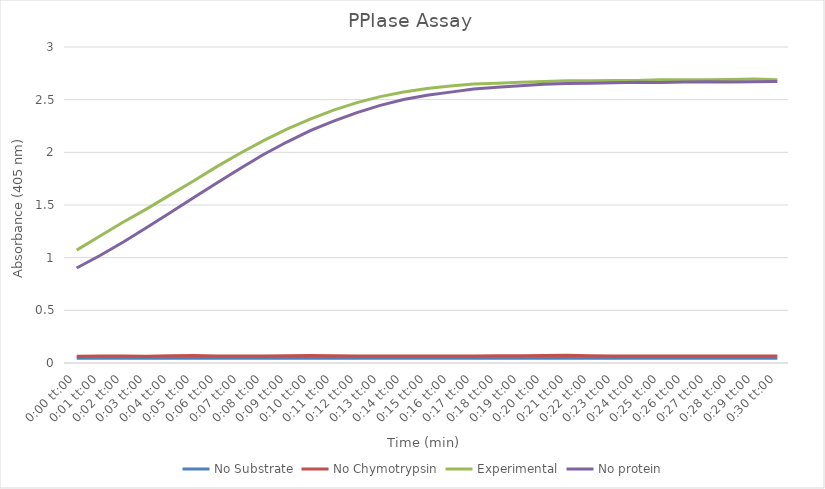
| Category | No Substrate | No Chymotrypsin | Experimental | No protein |
|---|---|---|---|---|
| 0.0 | 0.044 | 0.065 | 1.072 | 0.902 |
| 0.000694444444444444 | 0.044 | 0.067 | 1.206 | 1.02 |
| 0.00138888888888889 | 0.046 | 0.066 | 1.338 | 1.149 |
| 0.00208333333333333 | 0.045 | 0.064 | 1.463 | 1.287 |
| 0.00277777777777778 | 0.044 | 0.07 | 1.596 | 1.427 |
| 0.00347222222222222 | 0.044 | 0.07 | 1.728 | 1.568 |
| 0.00416666666666667 | 0.044 | 0.067 | 1.864 | 1.708 |
| 0.00486111111111111 | 0.044 | 0.067 | 1.992 | 1.846 |
| 0.00555555555555555 | 0.044 | 0.067 | 2.11 | 1.98 |
| 0.00625 | 0.044 | 0.069 | 2.219 | 2.098 |
| 0.00694444444444444 | 0.044 | 0.072 | 2.315 | 2.206 |
| 0.00763888888888889 | 0.044 | 0.07 | 2.401 | 2.296 |
| 0.00833333333333333 | 0.044 | 0.067 | 2.471 | 2.377 |
| 0.00902777777777778 | 0.044 | 0.066 | 2.529 | 2.445 |
| 0.00972222222222222 | 0.044 | 0.065 | 2.572 | 2.501 |
| 0.0104166666666667 | 0.044 | 0.066 | 2.605 | 2.542 |
| 0.0111111111111111 | 0.044 | 0.067 | 2.629 | 2.572 |
| 0.0118055555555556 | 0.044 | 0.067 | 2.648 | 2.6 |
| 0.0125 | 0.044 | 0.068 | 2.657 | 2.618 |
| 0.0131944444444444 | 0.044 | 0.07 | 2.665 | 2.632 |
| 0.0138888888888889 | 0.044 | 0.072 | 2.672 | 2.645 |
| 0.0145833333333333 | 0.044 | 0.074 | 2.678 | 2.654 |
| 0.0152777777777778 | 0.044 | 0.07 | 2.68 | 2.657 |
| 0.0159722222222222 | 0.044 | 0.066 | 2.682 | 2.661 |
| 0.0166666666666667 | 0.044 | 0.066 | 2.683 | 2.665 |
| 0.0173611111111111 | 0.044 | 0.066 | 2.688 | 2.664 |
| 0.0180555555555556 | 0.044 | 0.066 | 2.688 | 2.667 |
| 0.01875 | 0.044 | 0.066 | 2.688 | 2.671 |
| 0.0194444444444444 | 0.044 | 0.066 | 2.691 | 2.669 |
| 0.0201388888888889 | 0.044 | 0.067 | 2.696 | 2.67 |
| 0.0208333333333333 | 0.044 | 0.067 | 2.689 | 2.673 |